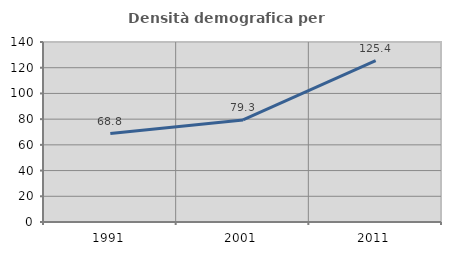
| Category | Densità demografica |
|---|---|
| 1991.0 | 68.792 |
| 2001.0 | 79.338 |
| 2011.0 | 125.445 |